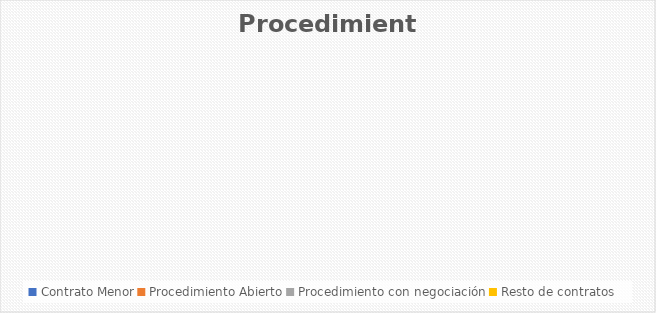
| Category | Series 0 |
|---|---|
| Contrato Menor | 0 |
| Procedimiento Abierto | 0 |
| Procedimiento con negociación | 0 |
| Resto de contratos | 0 |